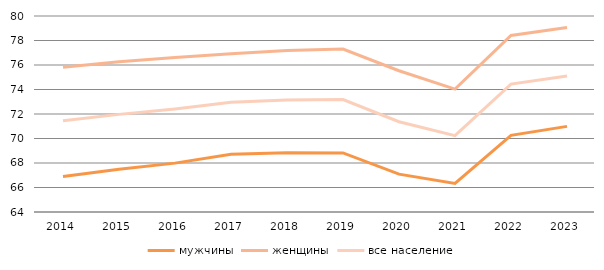
| Category | мужчины | женщины | все население |
|---|---|---|---|
| 2014.0 | 66.9 | 75.82 | 71.44 |
| 2015.0 | 67.49 | 76.26 | 71.97 |
| 2016.0 | 67.99 | 76.61 | 72.41 |
| 2017.0 | 68.72 | 76.92 | 72.95 |
| 2018.0 | 68.84 | 77.19 | 73.15 |
| 2019.0 | 68.82 | 77.3 | 73.18 |
| 2020.0 | 67.09 | 75.53 | 71.37 |
| 2021.0 | 66.33 | 74.03 | 70.23 |
| 2022.0 | 70.26 | 78.41 | 74.44 |
| 2023.0 | 70.989 | 79.055 | 75.094 |